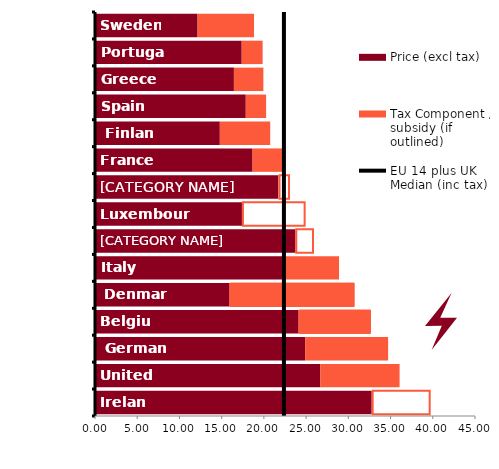
| Category | Price (excl tax) | Tax Component / subsidy (if outlined) |
|---|---|---|
| Ireland | 32.76 | 6.873 |
| United Kingdom | 26.696 | 9.374 |
| Germany | 24.885 | 9.826 |
| Belgium | 24.117 | 8.505 |
| Denmark | 15.94 | 14.748 |
| Italy | 22.148 | 6.752 |
| Austria | 23.728 | 2.09 |
| Luxembourg | 17.399 | 7.426 |
| Netherlands | 21.716 | 1.243 |
| France | 18.66 | 3.713 |
| Finland | 14.783 | 5.967 |
| Spain | 17.857 | 2.409 |
| Greece | 16.449 | 3.488 |
| Portugal | 17.373 | 2.478 |
| Sweden | 12.149 | 6.683 |